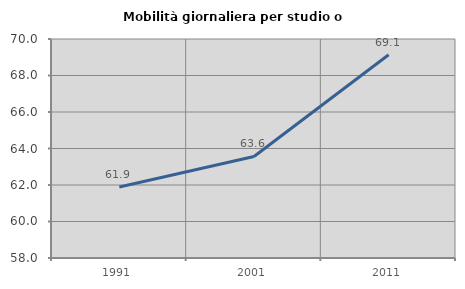
| Category | Mobilità giornaliera per studio o lavoro |
|---|---|
| 1991.0 | 61.891 |
| 2001.0 | 63.564 |
| 2011.0 | 69.136 |